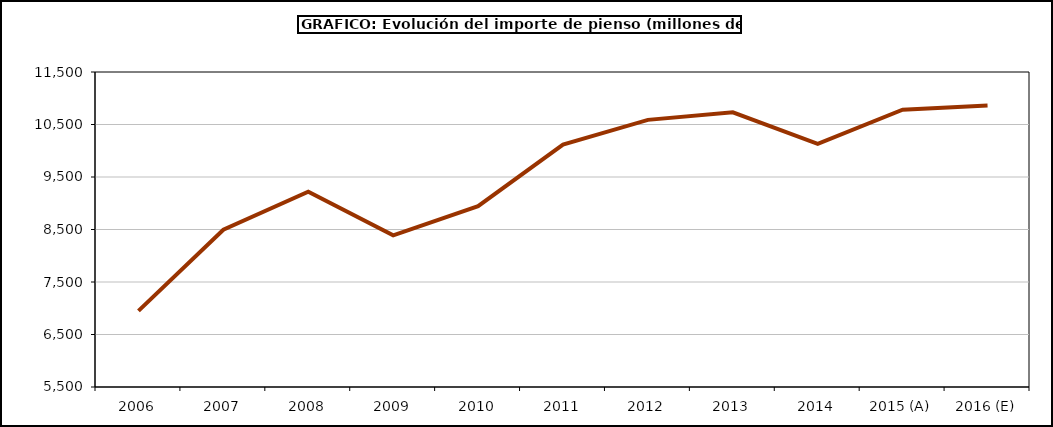
| Category | piensos |
|---|---|
| 2006 | 6950.753 |
| 2007 | 8496.174 |
| 2008 | 9220.925 |
| 2009 | 8388.144 |
| 2010 | 8943.629 |
| 2011 | 10115.595 |
| 2012 | 10588.115 |
| 2013 | 10733.318 |
| 2014 | 10132.591 |
| 2015 (A) | 10781.163 |
| 2016 (E) | 10861.457 |